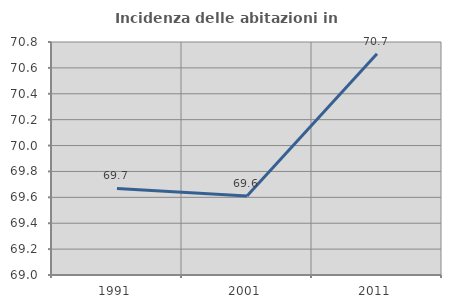
| Category | Incidenza delle abitazioni in proprietà  |
|---|---|
| 1991.0 | 69.668 |
| 2001.0 | 69.61 |
| 2011.0 | 70.709 |